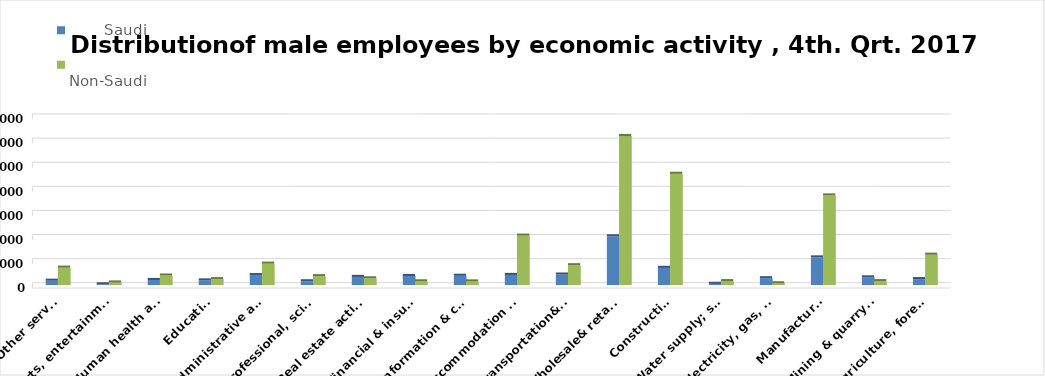
| Category |        Saudi      |          Non-Saudi        |
|---|---|---|
| Agriculture, forestry & fishing | 48972 | 251399 |
| Mining & quarrying | 63371 | 32237 |
| Manufacturing | 229281 | 743342 |
| Electricity, gas, steam & air conditioning supply | 56269 | 14400 |
| Water supply; sewerage, waste remediation  | 10022 | 32221 |
| Construction | 142092 | 923107 |
| Wholesale& retail trade; repair of motor vehicles | 403925 | 1236321 |
| Transportation& storage | 86783 | 164109 |
| Accommodation & food service activities | 83723 | 409958 |
| Information & communication | 76675 | 29898 |
| Financial & insurance | 74807 | 30512 |
| Real estate activities | 67264 | 55454 |
| Professional, scientific & technical activities | 30897 | 73503 |
| Administrative and support service activities | 82229 | 177261 |
| Education | 38129 | 48869 |
| Human health and &l work activities | 41908 | 78805 |
| Arts, entertainment & recreation | 5777 | 20983 |
| Other service | 35850 | 144018 |